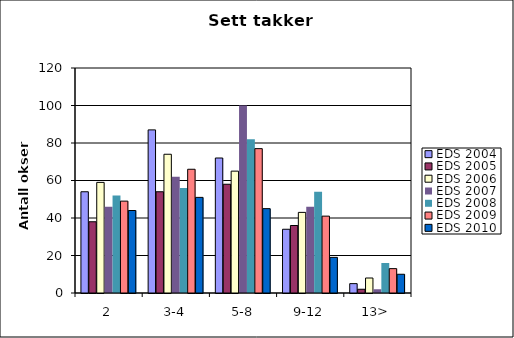
| Category | EDS 2004 | EDS 2005 | EDS 2006 | EDS 2007 | EDS 2008 | EDS 2009 | EDS 2010 |
|---|---|---|---|---|---|---|---|
| 2 | 54 | 38 | 59 | 46 | 52 | 49 | 44 |
| 3-4 | 87 | 54 | 74 | 62 | 56 | 66 | 51 |
| 5-8 | 72 | 58 | 65 | 100 | 82 | 77 | 45 |
| 9-12 | 34 | 36 | 43 | 46 | 54 | 41 | 19 |
| 13> | 5 | 2 | 8 | 2 | 16 | 13 | 10 |